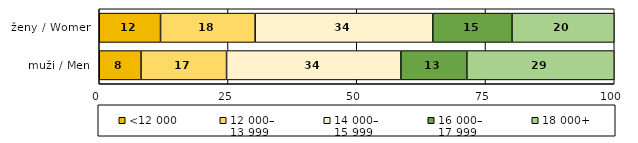
| Category | <12 000 | 12 000–
13 999 | 14 000–
15 999 | 16 000–
17 999 | 18 000+ |
|---|---|---|---|---|---|
| muži / Men | 8.108 | 16.615 | 33.847 | 12.813 | 28.616 |
| ženy / Women | 11.902 | 18.371 | 34.488 | 15.385 | 19.855 |